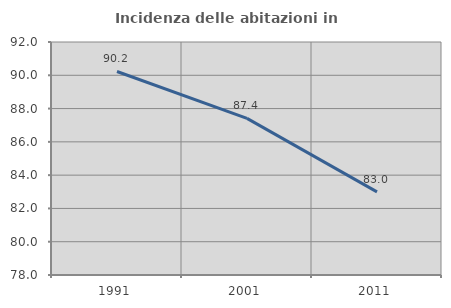
| Category | Incidenza delle abitazioni in proprietà  |
|---|---|
| 1991.0 | 90.228 |
| 2001.0 | 87.413 |
| 2011.0 | 82.994 |